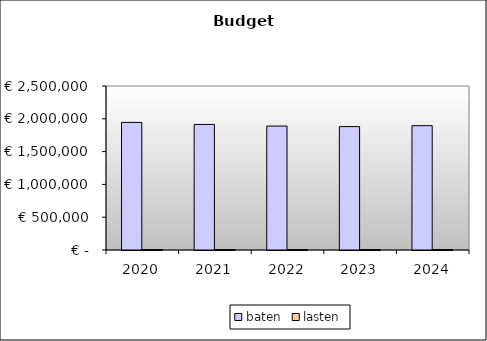
| Category | baten | lasten |
|---|---|---|
| 2020.0 | 1945055.286 | 7507.2 |
| 2021.0 | 1913937.981 | 7507.2 |
| 2022.0 | 1889501.93 | 7507.2 |
| 2023.0 | 1881139.325 | 7507.2 |
| 2024.0 | 1895279.545 | 7507.2 |